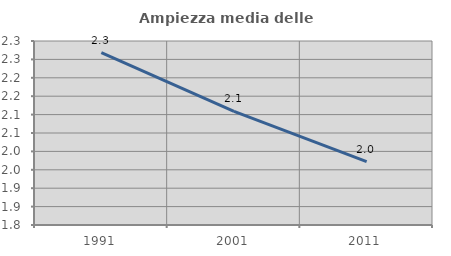
| Category | Ampiezza media delle famiglie |
|---|---|
| 1991.0 | 2.268 |
| 2001.0 | 2.109 |
| 2011.0 | 1.972 |